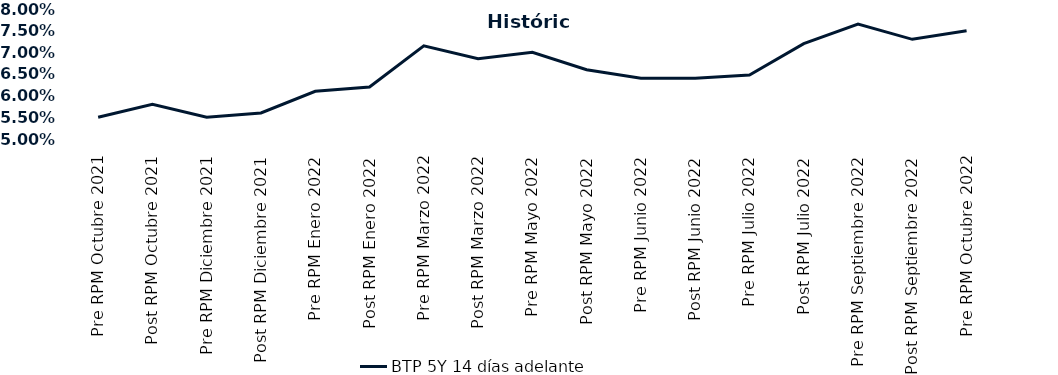
| Category | BTP 5Y 14 días adelante |
|---|---|
| Pre RPM Octubre 2021 | 0.055 |
| Post RPM Octubre 2021 | 0.058 |
| Pre RPM Diciembre 2021 | 0.055 |
| Post RPM Diciembre 2021 | 0.056 |
| Pre RPM Enero 2022 | 0.061 |
| Post RPM Enero 2022 | 0.062 |
| Pre RPM Marzo 2022 | 0.072 |
| Post RPM Marzo 2022 | 0.068 |
| Pre RPM Mayo 2022 | 0.07 |
| Post RPM Mayo 2022 | 0.066 |
| Pre RPM Junio 2022 | 0.064 |
| Post RPM Junio 2022 | 0.064 |
| Pre RPM Julio 2022 | 0.065 |
| Post RPM Julio 2022 | 0.072 |
| Pre RPM Septiembre 2022 | 0.076 |
| Post RPM Septiembre 2022 | 0.073 |
| Pre RPM Octubre 2022 | 0.075 |